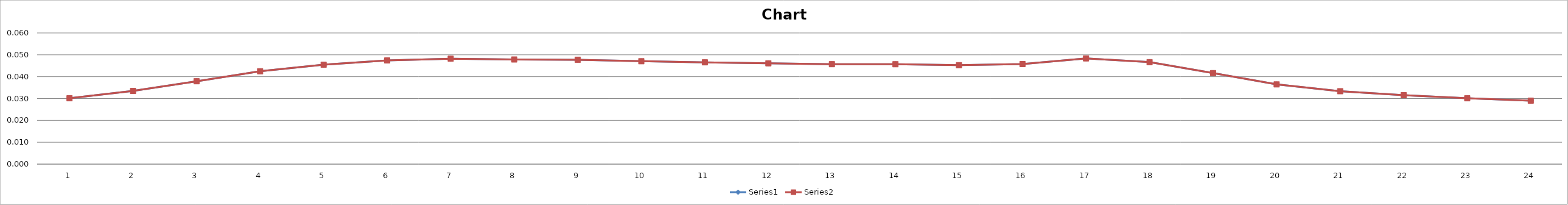
| Category | Series 0 | Series 1 |
|---|---|---|
| 0 | 0.03 | 0.03 |
| 1 | 0.033 | 0.033 |
| 2 | 0.038 | 0.038 |
| 3 | 0.042 | 0.042 |
| 4 | 0.045 | 0.045 |
| 5 | 0.047 | 0.047 |
| 6 | 0.048 | 0.048 |
| 7 | 0.048 | 0.048 |
| 8 | 0.048 | 0.048 |
| 9 | 0.047 | 0.047 |
| 10 | 0.047 | 0.047 |
| 11 | 0.046 | 0.046 |
| 12 | 0.046 | 0.046 |
| 13 | 0.046 | 0.046 |
| 14 | 0.045 | 0.045 |
| 15 | 0.046 | 0.046 |
| 16 | 0.048 | 0.048 |
| 17 | 0.047 | 0.047 |
| 18 | 0.042 | 0.042 |
| 19 | 0.036 | 0.036 |
| 20 | 0.033 | 0.033 |
| 21 | 0.032 | 0.032 |
| 22 | 0.03 | 0.03 |
| 23 | 0.029 | 0.029 |